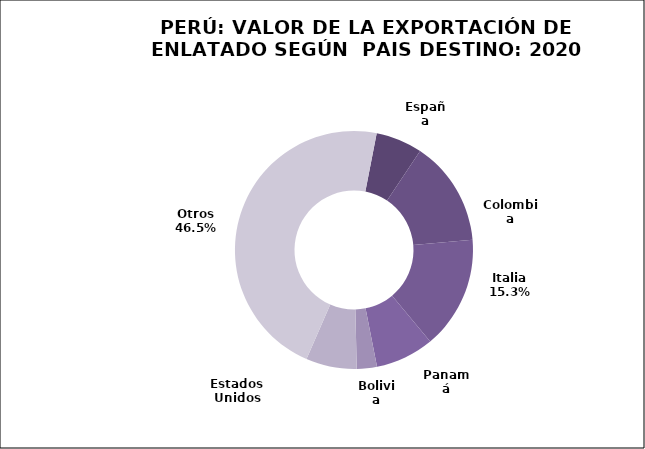
| Category | Series 0 |
|---|---|
| España | 3866.825 |
| Colombia | 8732.416 |
| Italia | 9361.414 |
| Panamá | 4870.602 |
| Bolivia | 1673.158 |
| Estados Unidos | 4222.973 |
| Otros | 28469.893 |